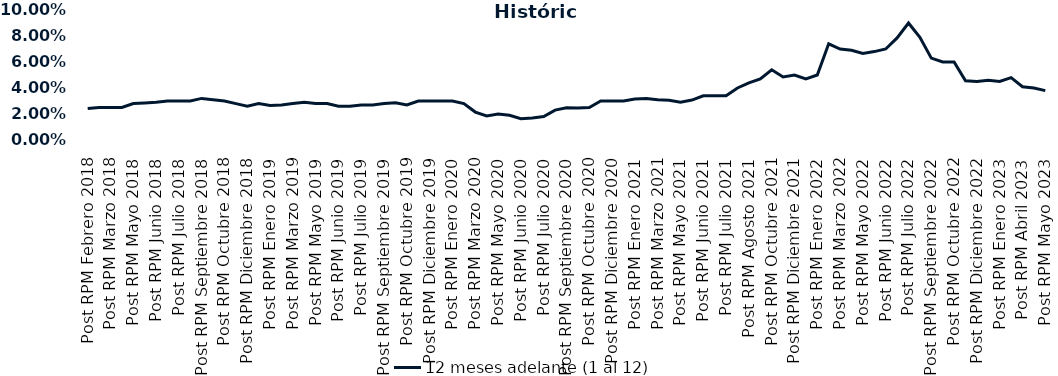
| Category | 12 meses adelante (1 al 12)  |
|---|---|
| Post RPM Febrero 2018 | 0.024 |
| Pre RPM Marzo 2018 | 0.025 |
| Post RPM Marzo 2018 | 0.025 |
| Pre RPM Mayo 2018 | 0.025 |
| Post RPM Mayo 2018 | 0.028 |
| Pre RPM Junio 2018 | 0.028 |
| Post RPM Junio 2018 | 0.029 |
| Pre RPM Julio 2018 | 0.03 |
| Post RPM Julio 2018 | 0.03 |
| Pre RPM Septiembre 2018 | 0.03 |
| Post RPM Septiembre 2018 | 0.032 |
| Pre RPM Octubre 2018 | 0.031 |
| Post RPM Octubre 2018 | 0.03 |
| Pre RPM Diciembre 2018 | 0.028 |
| Post RPM Diciembre 2018 | 0.026 |
| Pre RPM Enero 2019 | 0.028 |
| Post RPM Enero 2019 | 0.026 |
| Pre RPM Marzo 2019 | 0.027 |
| Post RPM Marzo 2019 | 0.028 |
| Pre RPM Mayo 2019 | 0.029 |
| Post RPM Mayo 2019 | 0.028 |
| Pre RPM Junio 2019 | 0.028 |
| Post RPM Junio 2019 | 0.026 |
| Pre RPM Julio 2019 | 0.026 |
| Post RPM Julio 2019 | 0.027 |
| Pre RPM Septiembre 2019 | 0.027 |
| Post RPM Septiembre 2019 | 0.028 |
| Pre RPM Octubre 2019 | 0.029 |
| Post RPM Octubre 2019 | 0.027 |
| Pre RPM Diciembre 2019 | 0.03 |
| Post RPM Diciembre 2019 | 0.03 |
| Pre RPM Enero 2020 | 0.03 |
| Post RPM Enero 2020 | 0.03 |
| Pre RPM Marzo 2020 | 0.028 |
| Post RPM Marzo 2020 | 0.022 |
| Pre RPM Mayo 2020 | 0.018 |
| Post RPM Mayo 2020 | 0.02 |
| Pre RPM Junio 2020 | 0.019 |
| Post RPM Junio 2020 | 0.016 |
| Pre RPM Julio 2020 | 0.017 |
| Post RPM Julio 2020 | 0.018 |
| Pre RPM Septiembre 2020 | 0.023 |
| Post RPM Septiembre 2020 | 0.025 |
| Pre RPM Octubre 2020 | 0.025 |
| Post RPM Octubre 2020 | 0.025 |
| Pre RPM Diciembre 2020 | 0.03 |
| Post RPM Diciembre 2020 | 0.03 |
| Pre RPM Enero 2021 | 0.03 |
| Post RPM Enero 2021 | 0.032 |
| Pre RPM Marzo 2021 | 0.032 |
| Post RPM Marzo 2021 | 0.031 |
| Pre RPM Mayo 2021 | 0.03 |
| Post RPM Mayo 2021 | 0.029 |
| Pre RPM Junio 2021 | 0.031 |
| Post RPM Junio 2021 | 0.034 |
| Pre RPM Julio 2021 | 0.034 |
| Post RPM Julio 2021 | 0.034 |
| Pre RPM Agosto 2021 | 0.04 |
| Post RPM Agosto 2021 | 0.044 |
| Pre RPM Octubre 2021 | 0.047 |
| Post RPM Octubre 2021 | 0.054 |
| Pre RPM Diciembre 2021 | 0.048 |
| Post RPM Diciembre 2021 | 0.05 |
| Pre RPM Enero 2022 | 0.047 |
| Post RPM Enero 2022 | 0.05 |
| Pre RPM Marzo 2022 | 0.074 |
| Post RPM Marzo 2022 | 0.07 |
| Pre RPM Mayo 2022 | 0.069 |
| Post RPM Mayo 2022 | 0.066 |
| Pre RPM Junio 2022 | 0.068 |
| Post RPM Junio 2022 | 0.07 |
| Pre RPM Julio 2022 | 0.078 |
| Post RPM Julio 2022 | 0.09 |
| Pre RPM Septiembre 2022 | 0.079 |
| Post RPM Septiembre 2022 | 0.063 |
| Pre RPM Octubre 2022 | 0.06 |
| Post RPM Octubre 2022 | 0.06 |
| Pre RPM Diciembre 2022 | 0.046 |
| Post RPM Diciembre 2022 | 0.045 |
| Pre RPM Enero 2023 | 0.046 |
| Post RPM Enero 2023 | 0.045 |
| Pre RPM Abril 2023 | 0.048 |
| Post RPM Abril 2023 | 0.041 |
| Pre RPM Mayo 2023 | 0.04 |
| Post RPM Mayo 2023 | 0.038 |